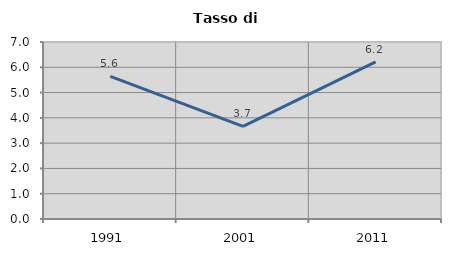
| Category | Tasso di disoccupazione   |
|---|---|
| 1991.0 | 5.641 |
| 2001.0 | 3.66 |
| 2011.0 | 6.215 |